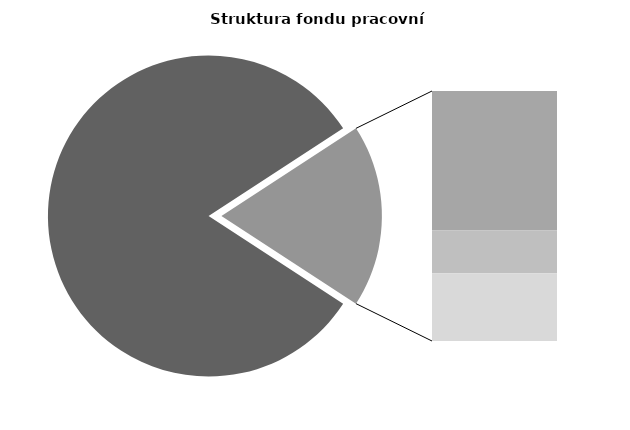
| Category | Series 0 |
|---|---|
| Průměrná měsíční odpracovaná doba bez přesčasu | 139.5 |
| Dovolená | 17.513 |
| Nemoc | 5.374 |
| Jiné | 8.513 |